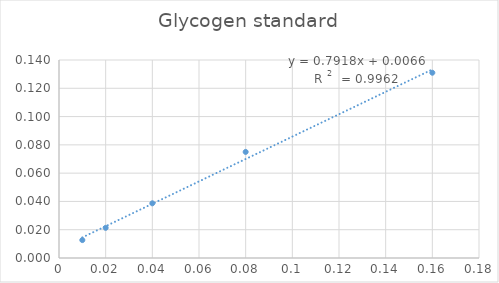
| Category | Series 0 |
|---|---|
| 0.01 | 0.013 |
| 0.02 | 0.021 |
| 0.04 | 0.039 |
| 0.08 | 0.075 |
| 0.16 | 0.131 |